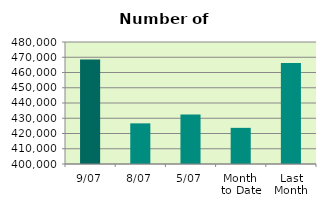
| Category | Series 0 |
|---|---|
| 9/07 | 468478 |
| 8/07 | 426648 |
| 5/07 | 432402 |
| Month 
to Date | 423704.857 |
| Last
Month | 466167.6 |